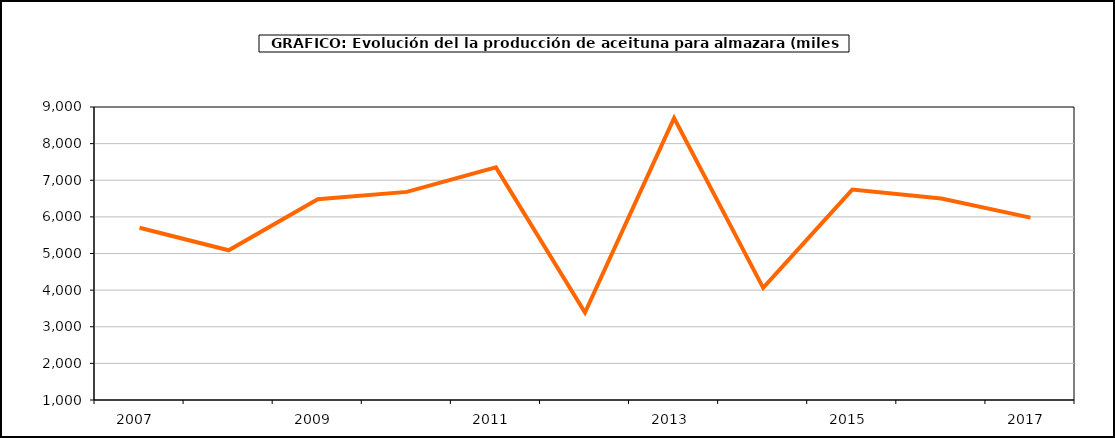
| Category | producción |
|---|---|
| 2007.0 | 5701.679 |
| 2008.0 | 5088.942 |
| 2009.0 | 6482.726 |
| 2010.0 | 6682.009 |
| 2011.0 | 7352.697 |
| 2012.0 | 3387.3 |
| 2013.0 | 8695.861 |
| 2014.0 | 4060.978 |
| 2015.0 | 6745.306 |
| 2016.0 | 6499.902 |
| 2017.0 | 5979.204 |